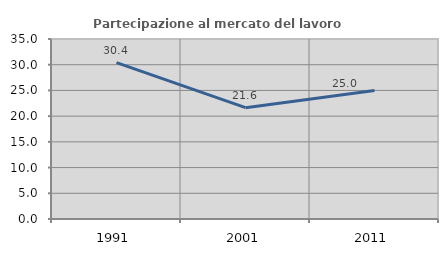
| Category | Partecipazione al mercato del lavoro  femminile |
|---|---|
| 1991.0 | 30.403 |
| 2001.0 | 21.645 |
| 2011.0 | 25 |